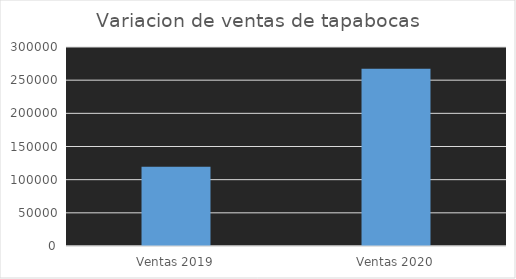
| Category | Series 0 |
|---|---|
| Ventas 2019 | 119403 |
| Ventas 2020 | 267107 |